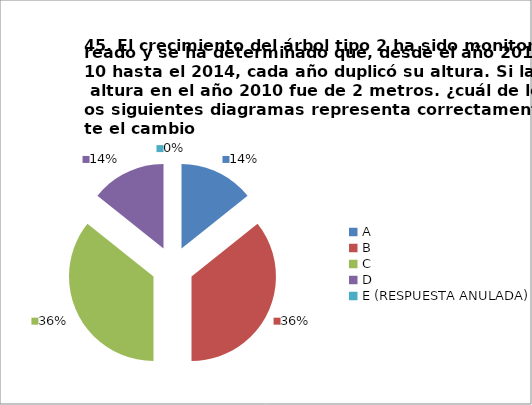
| Category | CANTIDAD DE RESPUESTAS PREGUNTA (45) | PORCENTAJE |
|---|---|---|
| A | 4 | 0.143 |
| B | 10 | 0.357 |
| C | 10 | 0.357 |
| D | 4 | 0.143 |
| E (RESPUESTA ANULADA) | 0 | 0 |